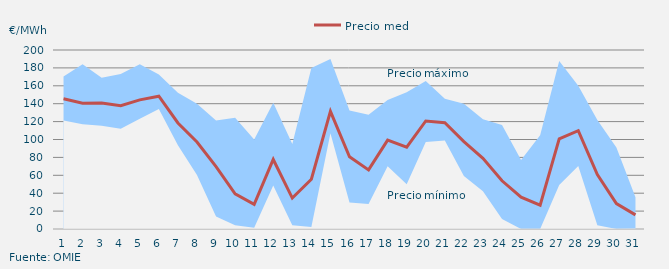
| Category | Precio medio |
|---|---|
| 1.0 | 145.567 |
| 2.0 | 140.618 |
| 3.0 | 140.839 |
| 4.0 | 137.675 |
| 5.0 | 144.268 |
| 6.0 | 148.411 |
| 7.0 | 118.499 |
| 8.0 | 97.25 |
| 9.0 | 69.631 |
| 10.0 | 39.292 |
| 11.0 | 27.495 |
| 12.0 | 77.689 |
| 13.0 | 34.57 |
| 14.0 | 55.602 |
| 15.0 | 131.412 |
| 16.0 | 80.769 |
| 17.0 | 66.01 |
| 18.0 | 99.272 |
| 19.0 | 91.453 |
| 20.0 | 120.726 |
| 21.0 | 118.809 |
| 22.0 | 97.621 |
| 23.0 | 79.006 |
| 24.0 | 53.883 |
| 25.0 | 35.486 |
| 26.0 | 26.641 |
| 27.0 | 100.612 |
| 28.0 | 109.838 |
| 29.0 | 60.789 |
| 30.0 | 28.436 |
| 31.0 | 15.75 |